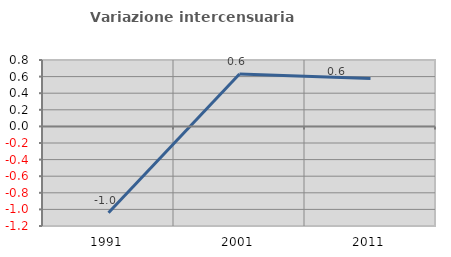
| Category | Variazione intercensuaria annua |
|---|---|
| 1991.0 | -1.039 |
| 2001.0 | 0.632 |
| 2011.0 | 0.578 |